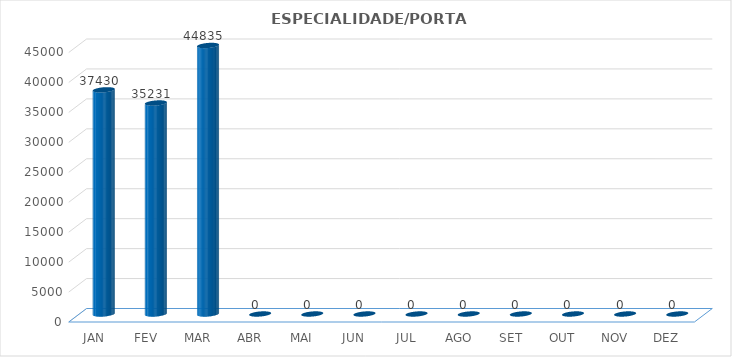
| Category | Series 0 |
|---|---|
| JAN | 37430 |
| FEV | 35231 |
| MAR | 44835 |
| ABR | 0 |
| MAI | 0 |
| JUN | 0 |
| JUL | 0 |
| AGO | 0 |
| SET | 0 |
| OUT | 0 |
| NOV | 0 |
| DEZ | 0 |